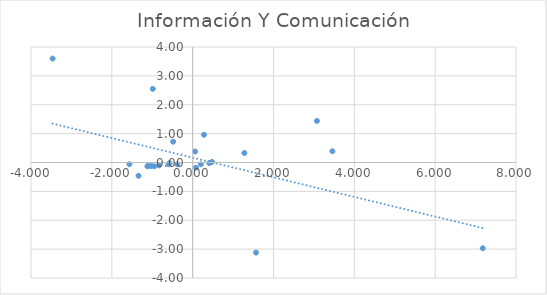
| Category | Información Y Comunicación |
|---|---|
| 0.06052582200249956 | 0.38 |
| -1.339539147515001 | -0.46 |
| -1.1203229332582998 | -0.13 |
| -0.9862037445886013 | 2.55 |
| -3.4662710747771994 | 3.6 |
| 0.4103518494638997 | -0.02 |
| -1.5653149541481977 | -0.06 |
| 1.5673496706761991 | -3.12 |
| 7.1770364527009995 | -2.97 |
| 0.47884246635880034 | 0.02 |
| -0.832734952533401 | -0.1 |
| 3.4562493478376117 | 0.39 |
| 0.28079979651694786 | 0.96 |
| -0.5906758229193689 | -0.06 |
| -0.38208630553888956 | -0.06 |
| -0.5726169698249004 | -0.02 |
| 0.08025158798270066 | -0.18 |
| 1.2789830493301095 | 0.33 |
| -1.1005497828799102 | -0.12 |
| 0.20330044603610042 | -0.06 |
| -0.48222478231940147 | 0.72 |
| -0.9518304220709997 | -0.13 |
| -1.027059621055 | -0.12 |
| 3.074367518631871 | 1.44 |